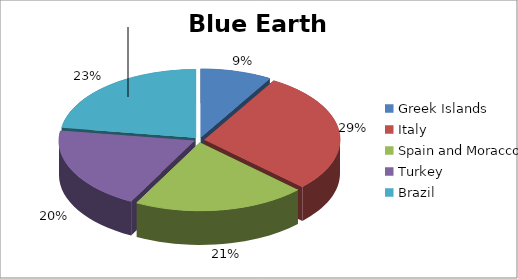
| Category | Series 0 |
|---|---|
| Greek Islands | 0.085 |
| Italy | 0.286 |
| Spain and Moracco | 0.206 |
| Turkey  | 0.196 |
| Brazil | 0.227 |